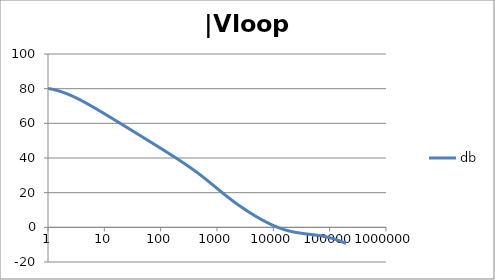
| Category | db |
|---|---|
| 1.0 | 80.139 |
| 1.0634378492473788 | 79.983 |
| 1.1309000592118907 | 79.813 |
| 1.2026419266820265 | 79.629 |
| 1.278934943925458 | 79.429 |
| 1.3600678260954062 | 79.214 |
| 1.4463476038134566 | 78.983 |
| 1.5381007850634825 | 78.735 |
| 1.6356745907936145 | 78.472 |
| 1.739438268902148 | 78.191 |
| 1.849784491579884 | 77.895 |
| 1.967130841296868 | 77.582 |
| 2.091921391056928 | 77.254 |
| 2.2246283849001642 | 76.91 |
| 2.365754025012901 | 76.551 |
| 2.5158323722080485 | 76.179 |
| 2.6754313669678584 | 75.792 |
| 2.8451549786972743 | 75.393 |
| 3.025645491321301 | 74.982 |
| 3.2175859338757533 | 74.56 |
| 3.42170266528945 | 74.127 |
| 3.6387681231394358 | 73.685 |
| 3.8696037467813236 | 73.233 |
| 4.115083085916729 | 72.773 |
| 4.376135106361553 | 72.306 |
| 4.653747705525078 | 71.832 |
| 4.948971450903514 | 71.351 |
| 5.262923555735513 | 70.865 |
| 5.596792106864742 | 70.374 |
| 5.951840560808945 | 69.878 |
| 6.329412525049976 | 69.378 |
| 6.730936842638569 | 68.874 |
| 7.157932999355504 | 68.367 |
| 7.612016873891456 | 67.857 |
| 8.094906852805886 | 67.344 |
| 8.608430333405762 | 66.829 |
| 9.154530639152917 | 66.312 |
| 9.735274373770007 | 65.792 |
| 10.352859241875105 | 65.271 |
| 11.009622365740512 | 64.749 |
| 11.708049129648925 | 64.225 |
| 12.4507825853165 | 63.7 |
| 13.240633453975693 | 63.174 |
| 14.080590762968805 | 62.646 |
| 14.973833157104059 | 62.119 |
| 15.923740927579823 | 61.59 |
| 16.93390880399795 | 61.06 |
| 18.008159557874837 | 60.53 |
| 19.150558469130036 | 60 |
| 20.365428710297824 | 59.469 |
| 21.65736770667993 | 58.937 |
| 23.031264534351347 | 58.405 |
| 24.492318421858034 | 57.873 |
| 26.046058425622668 | 57.34 |
| 27.698364353515743 | 56.807 |
| 29.45548901577305 | 56.274 |
| 31.32408188746347 | 55.74 |
| 33.311214272052936 | 55.207 |
| 35.42440606129053 | 54.672 |
| 37.67165419268462 | 54.138 |
| 40.06146291225952 | 53.603 |
| 42.60287595711691 | 53.068 |
| 45.30551077958928 | 52.533 |
| 48.17959494250036 | 51.998 |
| 51.23600482326248 | 51.462 |
| 54.486306773278585 | 50.926 |
| 57.94280088840825 | 50.389 |
| 61.61856755613799 | 49.852 |
| 65.52751695560372 | 49.315 |
| 69.68444169778837 | 48.777 |
| 74.10507280510043 | 48.238 |
| 78.80613924217637 | 47.699 |
| 83.8054312231895 | 47.159 |
| 89.12186753523771 | 46.619 |
| 94.77556713258299 | 46.077 |
| 100.78792527267464 | 45.535 |
| 107.18169448207877 | 44.992 |
| 113.98107065871142 | 44.447 |
| 121.21178463621371 | 43.901 |
| 128.90119955697148 | 43.354 |
| 137.07841442227294 | 42.804 |
| 145.77437421146283 | 42.253 |
| 155.02198698682062 | 41.7 |
| 164.85624842731968 | 41.145 |
| 175.3143742625403 | 40.587 |
| 186.43594110790573 | 40.026 |
| 198.26303623420247 | 39.462 |
| 210.84041683815525 | 38.895 |
| 224.21567941678887 | 38.324 |
| 238.43943988652958 | 37.748 |
| 253.56552512868072 | 37.168 |
| 269.65117668612646 | 36.583 |
| 286.75726738211927 | 35.992 |
| 304.9485316808965 | 35.396 |
| 324.2938106618788 | 34.793 |
| 344.8663125345048 | 34.184 |
| 366.7438896795682 | 33.567 |
| 390.00933326545766 | 32.943 |
| 414.7506865542229 | 32.312 |
| 441.06157808309626 | 31.672 |
| 469.0415759823428 | 31.024 |
| 498.7965647702637 | 30.368 |
| 530.4391460512702 | 29.704 |
| 564.089064633379 | 29.031 |
| 599.8736616776864 | 28.351 |
| 637.9283565946681 | 27.664 |
| 678.3971595109495 | 26.969 |
| 721.4332162458546 | 26.269 |
| 767.1993878601115 | 25.564 |
| 815.868866969862 | 24.855 |
| 867.6258331583267 | 24.142 |
| 922.6661499653554 | 23.428 |
| 981.1981060925172 | 22.713 |
| 1043.443203628628 | 21.998 |
| 1109.6369962786232 | 21.286 |
| 1180.0299807678607 | 20.576 |
| 1254.8885447951977 | 19.871 |
| 1334.4959751221782 | 19.171 |
| 1419.1535296132129 | 18.477 |
| 1509.1815772837017 | 17.79 |
| 1604.9208106703452 | 17.111 |
| 1706.7335351116335 | 16.44 |
| 1815.0050398174897 | 15.778 |
| 1930.1450559166665 | 15.125 |
| 2052.58930699948 | 14.481 |
| 2182.801158023697 | 13.847 |
| 2321.2733688234066 | 13.222 |
| 2468.5299588567814 | 12.607 |
| 2625.128190249376 | 12.001 |
| 2791.6606766374607 | 11.403 |
| 2968.757625791824 | 10.815 |
| 3157.08922450881 | 10.236 |
| 3357.3681747937244 | 9.665 |
| 3570.352390934236 | 9.103 |
| 3796.8478676703417 | 8.549 |
| 4037.7117303148448 | 8.003 |
| 4293.8554783669315 | 7.466 |
| 4566.248434893605 | 6.938 |
| 4855.9214147324665 | 6.417 |
| 5163.970625397384 | 5.906 |
| 5491.561815449236 | 5.403 |
| 5839.934686030357 | 4.91 |
| 6210.40758225729 | 4.426 |
| 6604.382482225307 | 3.952 |
| 7023.350302504747 | 3.489 |
| 7468.896540206577 | 3.037 |
| 7942.707272968458 | 2.597 |
| 8446.575539567106 | 2.169 |
| 8982.408125302747 | 1.753 |
| 9552.232777834151 | 1.352 |
| 10158.205880770249 | 0.964 |
| 10802.620614058389 | 0.591 |
| 11487.915632049675 | 0.233 |
| 12216.684292082227 | -0.11 |
| 12991.684468506162 | -0.436 |
| 13815.848989288772 | -0.746 |
| 14692.296734695852 | -1.039 |
| 15624.344440049217 | -1.316 |
| 16615.519247226184 | -1.577 |
| 17669.572052398642 | -1.821 |
| 18790.49170052441 | -2.05 |
| 19982.5200803064 | -2.263 |
| 21250.168176743602 | -2.461 |
| 22598.233142021272 | -2.645 |
| 24031.816449341983 | -2.816 |
| 25556.34319839602 | -2.975 |
| 27177.582645530147 | -3.122 |
| 28901.67003630542 | -3.259 |
| 30735.129823066054 | -3.387 |
| 32684.900355380338 | -3.507 |
| 34758.3601367905 | -3.621 |
| 36963.35574723439 | -3.73 |
| 39308.23153680468 | -3.834 |
| 41801.861203217486 | -3.937 |
| 44453.68137248706 | -4.039 |
| 47273.727309885995 | -4.141 |
| 50272.670896332245 | -4.245 |
| 53461.86101391677 | -4.353 |
| 56853.36649340195 | -4.466 |
| 60460.02178621637 | -4.586 |
| 64295.47553378361 | -4.713 |
| 68374.24221798431 | -4.85 |
| 72711.75708821259 | -4.997 |
| 77324.43457288652 | -5.156 |
| 82229.73039646025 | -5.327 |
| 87446.2076370035 | -5.512 |
| 92993.60697433475 | -5.712 |
| 98892.92139454243 | -5.927 |
| 105166.47563360249 | -6.158 |
| 111838.01066072512 | -6.404 |
| 118932.77352114675 | -6.667 |
| 126477.61287835392 | -6.946 |
| 134501.0806172993 | -7.242 |
| 143033.53989310883 | -7.553 |
| 152107.28003416685 | -7.88 |
| 161756.63873440344 | -8.221 |
| 172018.1319971993 | -8.578 |
| 182930.592322653 | -8.947 |
| 194535.31566115122 | -9.33 |